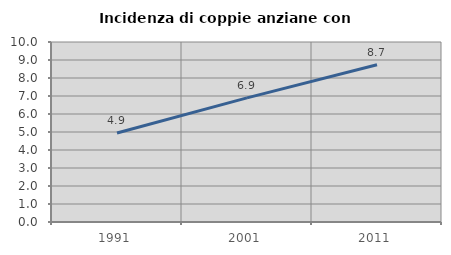
| Category | Incidenza di coppie anziane con figli |
|---|---|
| 1991.0 | 4.947 |
| 2001.0 | 6.897 |
| 2011.0 | 8.738 |